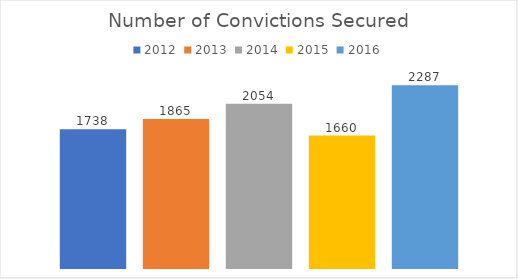
| Category | 2012 | 2013 | 2014 | 2015 | 2016 |
|---|---|---|---|---|---|
| 0 | 1738 | 1865 | 2054 | 1660 | 2287 |